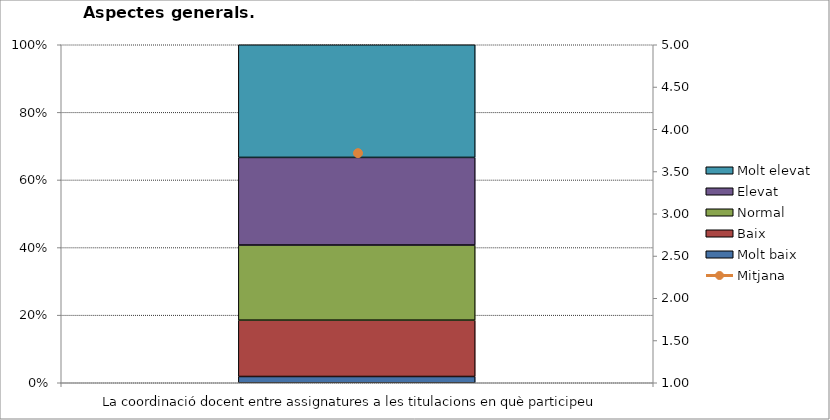
| Category | Molt baix | Baix | Normal  | Elevat | Molt elevat |
|---|---|---|---|---|---|
| La coordinació docent entre assignatures a les titulacions en què participeu | 1 | 9 | 12 | 14 | 18 |